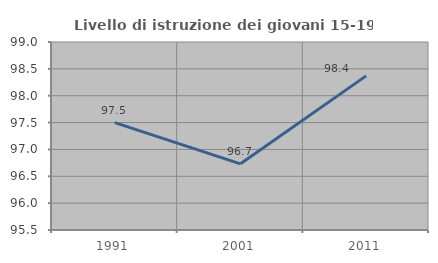
| Category | Livello di istruzione dei giovani 15-19 anni |
|---|---|
| 1991.0 | 97.5 |
| 2001.0 | 96.732 |
| 2011.0 | 98.37 |